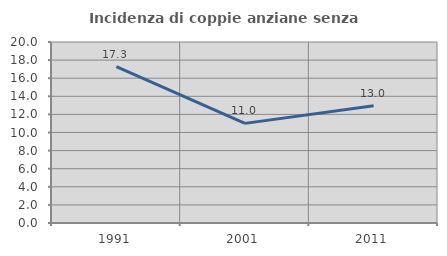
| Category | Incidenza di coppie anziane senza figli  |
|---|---|
| 1991.0 | 17.273 |
| 2001.0 | 11.009 |
| 2011.0 | 12.963 |